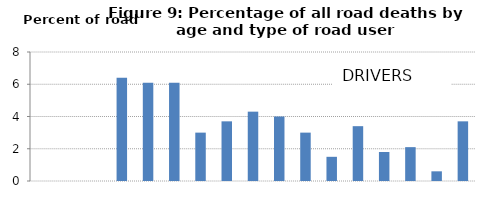
| Category | DRIVERS |
|---|---|
| 0-4  | 0 |
| 5-9 | 0 |
| 10-14 | 0 |
| 15-19  | 6.4 |
| 20-24  | 6.1 |
| 25-29  | 6.1 |
| 30-34  | 3 |
| 35-39  | 3.7 |
| 40-44  | 4.3 |
| 45-49  | 4 |
| 50-54  | 3 |
| 55-59  | 1.5 |
| 60-64  | 3.4 |
| 65-69  | 1.8 |
| 70-74  | 2.1 |
| 75-79  | 0.6 |
| 80+ | 3.7 |